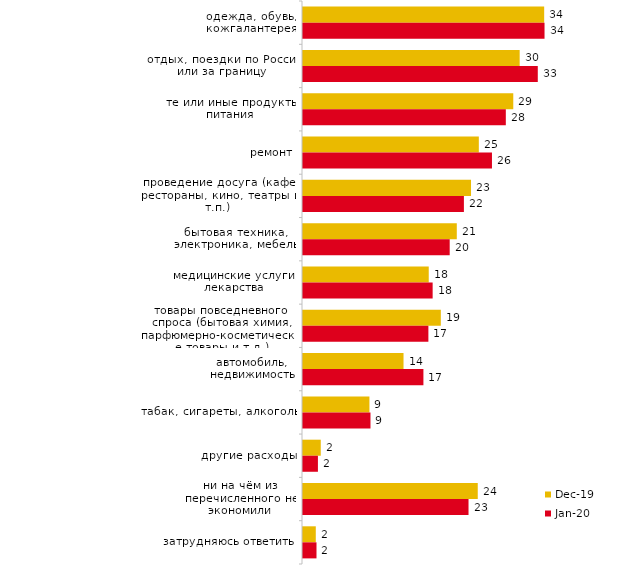
| Category | дек.19 | янв.20 |
|---|---|---|
| одежда, обувь, кожгалантерея | 33.614 | 33.663 |
| отдых, поездки по России или за границу | 30.198 | 32.723 |
| те или иные продукты питания | 29.307 | 28.267 |
| ремонт | 24.505 | 26.337 |
| проведение досуга (кафе, рестораны, кино, театры и т.п.) | 23.416 | 22.426 |
| бытовая техника, электроника, мебель | 21.436 | 20.446 |
| медицинские услуги, лекарства | 17.525 | 18.069 |
| товары повседневного спроса (бытовая химия, парфюмерно-косметические товары и т.д.) | 19.208 | 17.475 |
| автомобиль, недвижимость | 14.01 | 16.782 |
| табак, сигареты, алкоголь | 9.257 | 9.406 |
| другие расходы | 2.475 | 2.079 |
| ни на чём из перечисленного не экономили | 24.356 | 23.069 |
| затрудняюсь ответить | 1.782 | 1.881 |